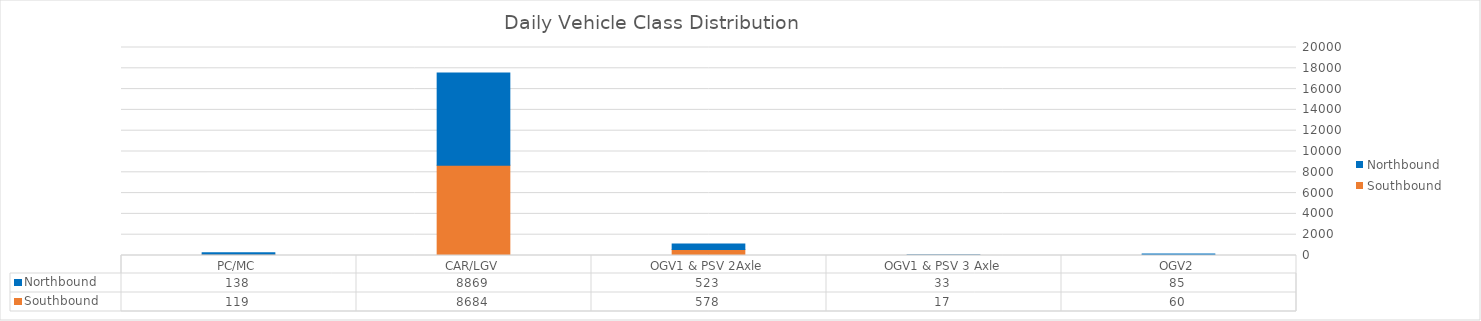
| Category | Southbound | Northbound |
|---|---|---|
| PC/MC | 119 | 138 |
| CAR/LGV | 8684 | 8869 |
| OGV1 & PSV 2Axle | 578 | 523 |
| OGV1 & PSV 3 Axle | 17 | 33 |
| OGV2 | 60 | 85 |